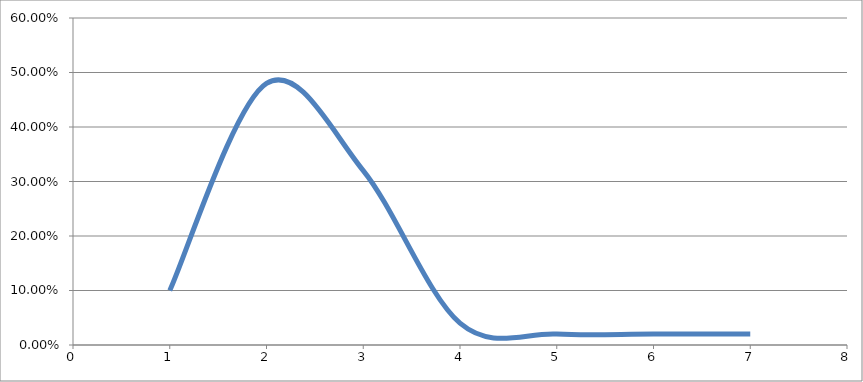
| Category | Series 0 |
|---|---|
| 0 | 0.1 |
| 1 | 0.48 |
| 2 | 0.32 |
| 3 | 0.04 |
| 4 | 0.02 |
| 5 | 0.02 |
| 6 | 0.02 |